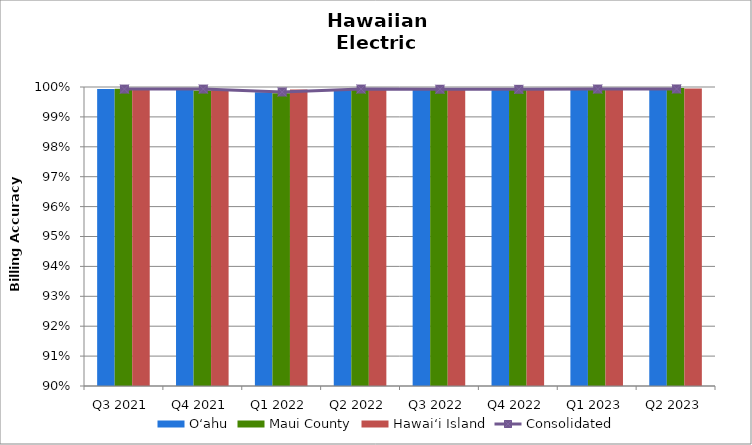
| Category | O‘ahu | Maui County | Hawai‘i Island |
|---|---|---|---|
| Q3 2021 | 0.999 | 0.999 | 0.999 |
| Q4 2021 | 0.999 | 0.999 | 0.999 |
| Q1 2022 | 0.998 | 0.998 | 0.999 |
| Q2 2022 | 0.999 | 0.999 | 0.999 |
| Q3 2022 | 0.999 | 0.999 | 0.999 |
| Q4 2022 | 0.999 | 0.999 | 0.999 |
| Q1 2023 | 0.999 | 0.999 | 0.999 |
| Q2 2023 | 0.999 | 1 | 1 |